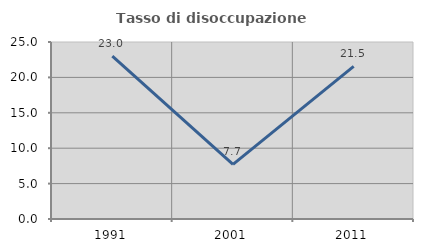
| Category | Tasso di disoccupazione giovanile  |
|---|---|
| 1991.0 | 22.995 |
| 2001.0 | 7.727 |
| 2011.0 | 21.549 |